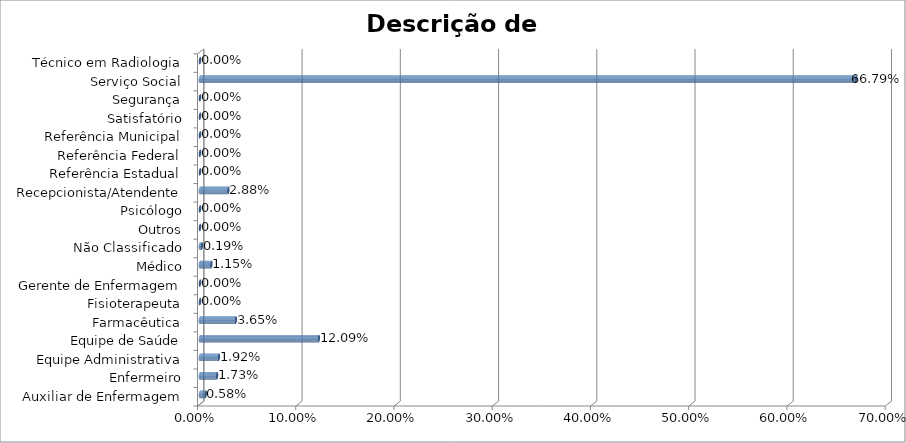
| Category | Series 0 |
|---|---|
| Auxiliar de Enfermagem | 0.006 |
| Enfermeiro | 0.017 |
| Equipe Administrativa | 0.019 |
| Equipe de Saúde | 0.121 |
| Farmacêutica | 0.036 |
| Fisioterapeuta | 0 |
| Gerente de Enfermagem | 0 |
| Médico | 0.012 |
| Não Classificado | 0.002 |
| Outros | 0 |
| Psicólogo | 0 |
| Recepcionista/Atendente | 0.029 |
| Referência Estadual | 0 |
| Referência Federal | 0 |
| Referência Municipal | 0 |
| Satisfatório | 0 |
| Segurança | 0 |
| Serviço Social | 0.668 |
| Técnico em Radiologia | 0 |